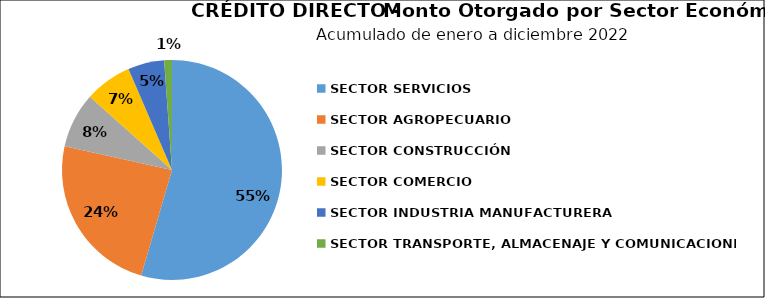
| Category | Monto | Créditos |
|---|---|---|
| SECTOR SERVICIOS | 28.316 | 10 |
| SECTOR AGROPECUARIO | 12.428 | 8 |
| SECTOR CONSTRUCCIÓN | 4.225 | 4 |
| SECTOR COMERCIO | 3.601 | 9 |
| SECTOR INDUSTRIA MANUFACTURERA | 2.769 | 3 |
| SECTOR TRANSPORTE, ALMACENAJE Y COMUNICACIONES | 0.592 | 2 |